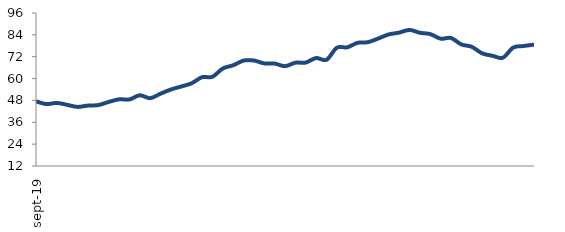
| Category | Series 0 |
|---|---|
| 2019-09-01 | 47.515 |
| 2019-10-01 | 45.989 |
| 2019-11-01 | 46.631 |
| 2019-12-01 | 45.576 |
| 2020-01-01 | 44.444 |
| 2020-02-01 | 45.166 |
| 2020-03-01 | 45.444 |
| 2020-04-01 | 47.162 |
| 2020-05-01 | 48.595 |
| 2020-06-01 | 48.53 |
| 2020-07-01 | 50.83 |
| 2020-08-01 | 49.231 |
| 2020-09-01 | 51.699 |
| 2020-10-01 | 53.991 |
| 2020-11-01 | 55.639 |
| 2020-12-01 | 57.413 |
| 2021-01-01 | 60.742 |
| 2021-02-01 | 60.984 |
| 2021-03-01 | 65.524 |
| 2021-04-01 | 67.28 |
| 2021-05-01 | 69.863 |
| 2021-06-01 | 69.912 |
| 2021-07-01 | 68.331 |
| 2021-08-01 | 68.248 |
| 2021-09-01 | 66.807 |
| 2021-10-01 | 68.707 |
| 2021-11-01 | 68.802 |
| 2021-12-01 | 71.282 |
| 2022-01-01 | 70.309 |
| 2022-02-01 | 76.939 |
| 2022-03-01 | 77.168 |
| 2022-04-01 | 79.628 |
| 2022-05-01 | 79.996 |
| 2022-06-01 | 82.029 |
| 2022-07-01 | 84.239 |
| 2022-08-01 | 85.232 |
| 2022-09-01 | 86.701 |
| 2022-10-01 | 85.146 |
| 2022-11-01 | 84.409 |
| 2022-12-01 | 81.907 |
| 2023-01-01 | 82.272 |
| 2023-02-01 | 78.738 |
| 2023-03-01 | 77.447 |
| 2023-04-01 | 73.856 |
| 2023-05-01 | 72.507 |
| 2023-06-01 | 71.462 |
| 2023-07-01 | 77.031 |
| 2023-08-01 | 77.876 |
| 2023-09-01 | 78.647 |